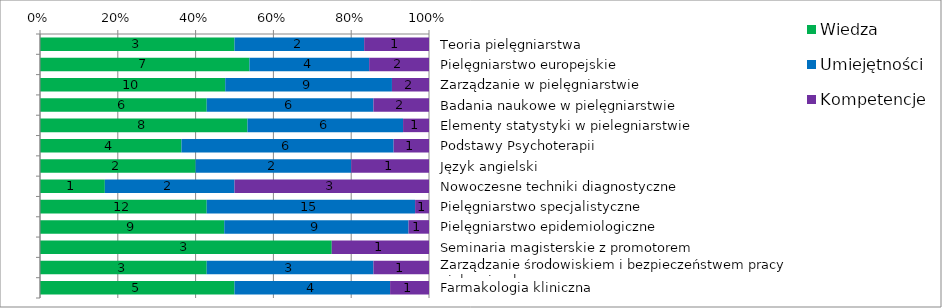
| Category | Wiedza | Umiejętności | Kompetencje |
|---|---|---|---|
| Teoria pielęgniarstwa | 3 | 2 | 1 |
| Pielęgniarstwo europejskie | 7 | 4 | 2 |
| Zarządzanie w pielęgniarstwie | 10 | 9 | 2 |
| Badania naukowe w pielęgniarstwie | 6 | 6 | 2 |
| Elementy statystyki w pielegniarstwie | 8 | 6 | 1 |
| Podstawy Psychoterapii | 4 | 6 | 1 |
| Język angielski | 2 | 2 | 1 |
| Nowoczesne techniki diagnostyczne | 1 | 2 | 3 |
| Pielęgniarstwo specjalistyczne | 12 | 15 | 1 |
| Pielęgniarstwo epidemiologiczne | 9 | 9 | 1 |
| Seminaria magisterskie z promotorem | 3 | 0 | 1 |
| Zarządzanie środowiskiem i bezpieczeństwem pracy pielęgniarek | 3 | 3 | 1 |
| Farmakologia kliniczna | 5 | 4 | 1 |